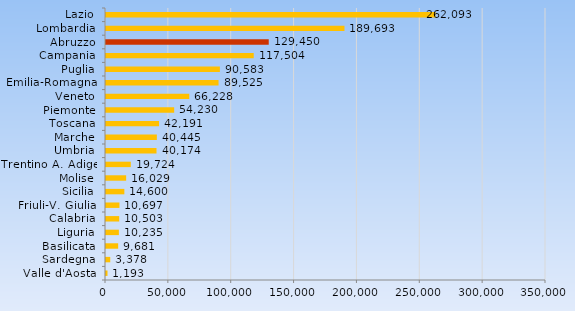
| Category | Series 0 |
|---|---|
| Valle d'Aosta | 1193 |
| Sardegna | 3378 |
| Basilicata | 9681 |
| Liguria | 10235 |
| Calabria | 10503 |
| Friuli-V. Giulia | 10697 |
| Sicilia | 14600 |
| Molise | 16029 |
| Trentino A. Adige | 19724 |
| Umbria | 40174 |
| Marche | 40445 |
| Toscana | 42191 |
| Piemonte | 54230 |
| Veneto | 66228 |
| Emilia-Romagna | 89525 |
| Puglia | 90583 |
| Campania | 117504 |
| Abruzzo | 129450 |
| Lombardia | 189693 |
| Lazio | 262093 |